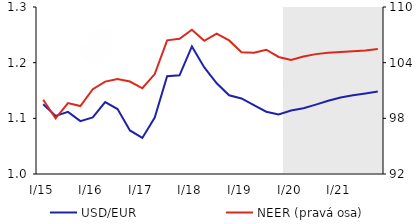
| Category | USD/EUR |
|---|---|
| I/15 | 1.125 |
| II | 1.104 |
| III | 1.112 |
| IV | 1.095 |
| I/16 | 1.102 |
| II | 1.129 |
| III | 1.117 |
| IV | 1.078 |
| I/17 | 1.065 |
| II | 1.102 |
| III | 1.176 |
| IV | 1.177 |
| I/18 | 1.229 |
| II | 1.191 |
| III | 1.163 |
| IV | 1.141 |
| I/19 | 1.136 |
| II | 1.124 |
| III | 1.112 |
| IV | 1.107 |
| I/20 | 1.114 |
| II | 1.118 |
| III | 1.125 |
| IV | 1.131 |
| I/21 | 1.137 |
| II | 1.141 |
| III | 1.145 |
| IV | 1.148 |